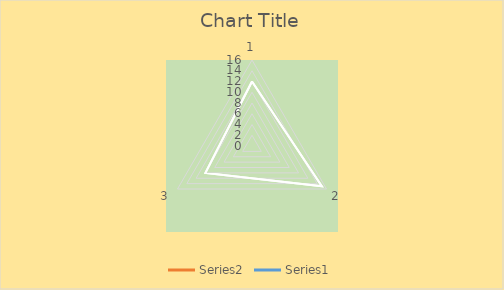
| Category | Series 1 | Series 0 |
|---|---|---|
| 0 | 12 | 12 |
| 1 | 15 | 15 |
| 2 | 10 | 10 |